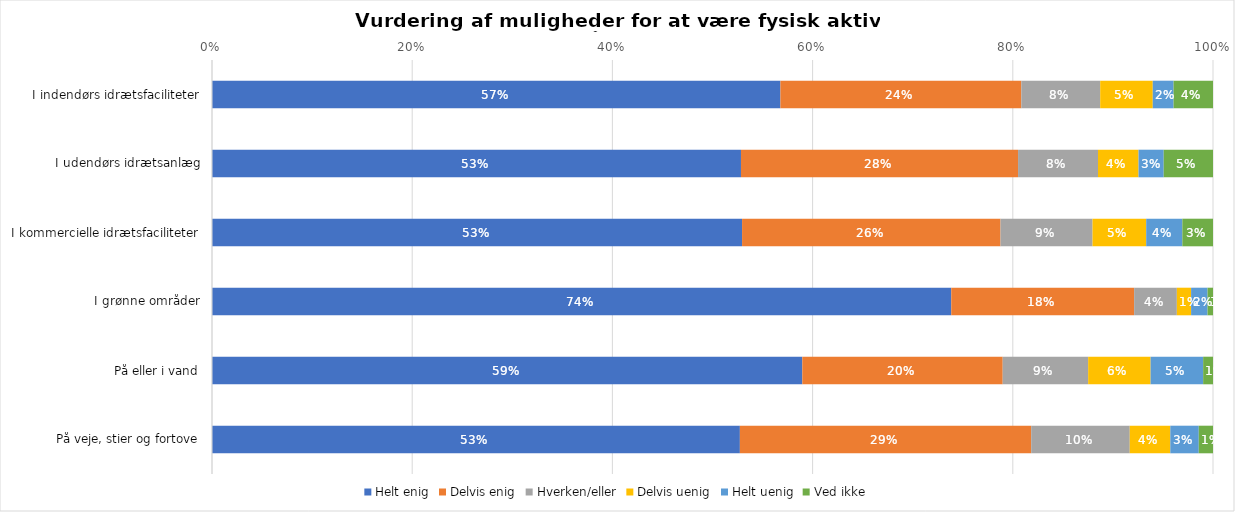
| Category | Helt enig | Delvis enig | Hverken/eller | Delvis uenig | Helt uenig | Ved ikke |
|---|---|---|---|---|---|---|
| I indendørs idrætsfaciliteter | 0.568 | 0.241 | 0.079 | 0.053 | 0.021 | 0.039 |
| I udendørs idrætsanlæg | 0.528 | 0.277 | 0.08 | 0.04 | 0.025 | 0.049 |
| I kommercielle idrætsfaciliteter | 0.53 | 0.258 | 0.092 | 0.054 | 0.036 | 0.031 |
| I grønne områder | 0.739 | 0.183 | 0.043 | 0.014 | 0.016 | 0.005 |
| På eller i vand | 0.59 | 0.2 | 0.085 | 0.062 | 0.053 | 0.01 |
| På veje, stier og fortove | 0.527 | 0.291 | 0.098 | 0.04 | 0.028 | 0.014 |